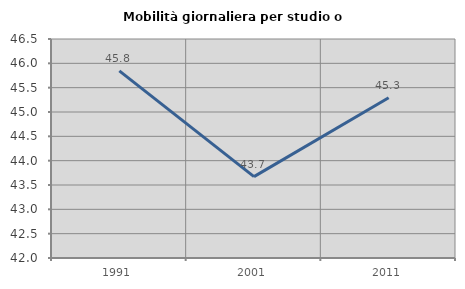
| Category | Mobilità giornaliera per studio o lavoro |
|---|---|
| 1991.0 | 45.845 |
| 2001.0 | 43.672 |
| 2011.0 | 45.293 |